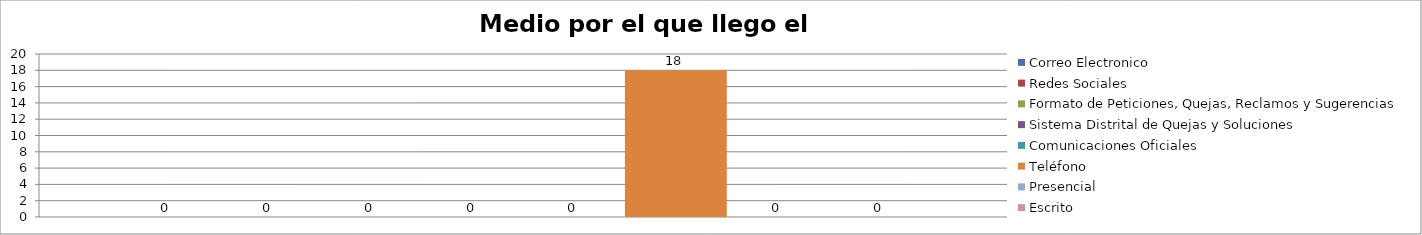
| Category | Correo Electronico | Redes Sociales | Formato de Peticiones, Quejas, Reclamos y Sugerencias | Sistema Distrital de Quejas y Soluciones  | Comunicaciones Oficiales | Teléfono | Presencial | Escrito  |
|---|---|---|---|---|---|---|---|---|
| 0 | 0 | 0 | 0 | 0 | 0 | 18 | 0 | 0 |